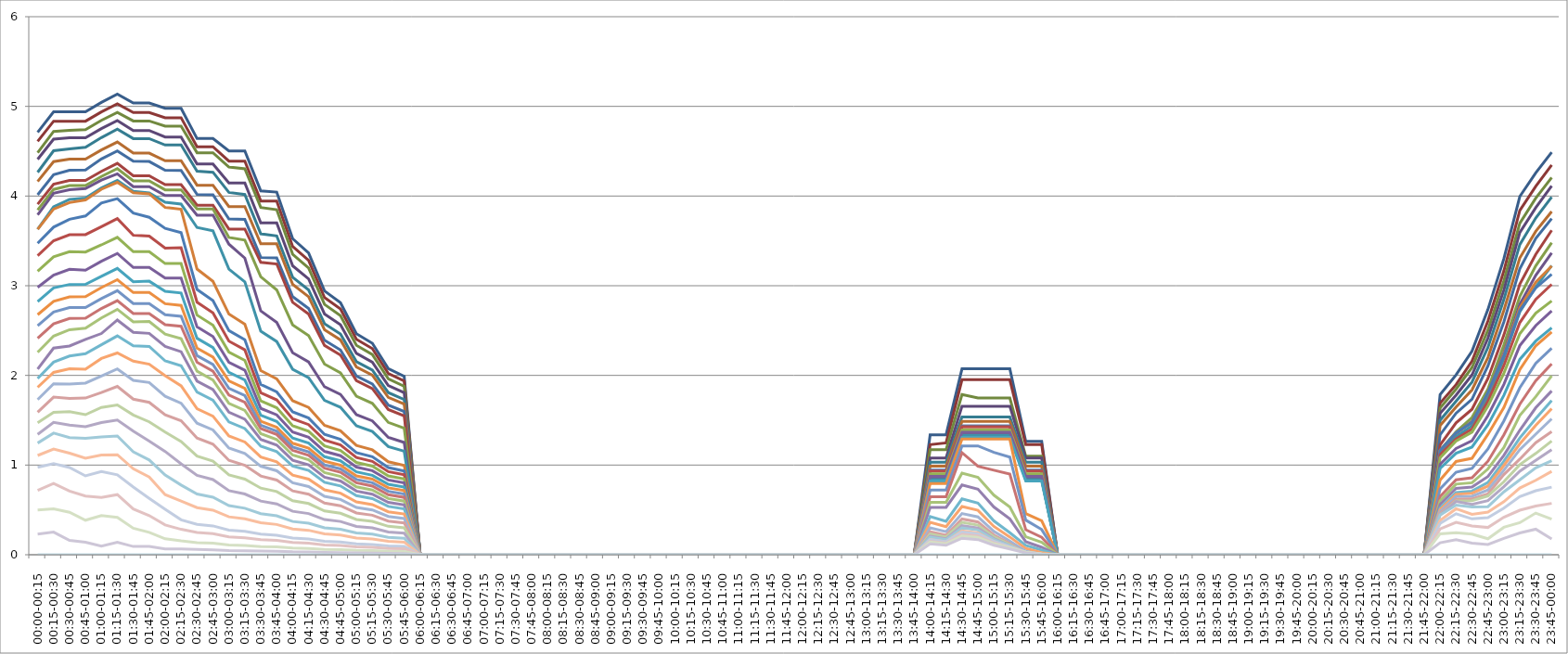
| Category | Series 0 | Series 1 | Series 2 | Series 3 | Series 4 | Series 5 | Series 6 | Series 7 | Series 8 | Series 9 | Series 10 | Series 11 | Series 12 | Series 13 | Series 14 | Series 15 | Series 16 | Series 17 | Series 18 | Series 19 | Series 20 | Series 21 | Series 22 | Series 23 | Series 24 | Series 25 | Series 26 | Series 27 | Series 28 | Series 29 | Series 30 | Series 31 | Series 32 | Series 33 | Series 34 |
|---|---|---|---|---|---|---|---|---|---|---|---|---|---|---|---|---|---|---|---|---|---|---|---|---|---|---|---|---|---|---|---|---|---|---|---|
| 00:00-00:15 | 4.71 | 4.61 | 4.484 | 4.41 | 4.265 | 4.162 | 4.014 | 3.91 | 3.845 | 3.791 | 3.629 | 3.629 | 3.473 | 3.335 | 3.162 | 2.982 | 2.822 | 2.677 | 2.554 | 2.415 | 2.258 | 2.07 | 1.966 | 1.867 | 1.73 | 1.589 | 1.472 | 1.342 | 1.245 | 1.107 | 0.974 | 0.718 | 0.499 | 0.23 | 0 |
| 00:15-00:30 | 4.939 | 4.835 | 4.72 | 4.634 | 4.505 | 4.384 | 4.238 | 4.131 | 4.074 | 4.031 | 3.879 | 3.855 | 3.654 | 3.501 | 3.323 | 3.119 | 2.976 | 2.826 | 2.707 | 2.575 | 2.438 | 2.304 | 2.148 | 2.033 | 1.906 | 1.758 | 1.588 | 1.476 | 1.356 | 1.179 | 1.016 | 0.795 | 0.512 | 0.253 | 0 |
| 00:30-00:45 | 4.939 | 4.835 | 4.733 | 4.649 | 4.526 | 4.412 | 4.288 | 4.174 | 4.117 | 4.07 | 3.963 | 3.928 | 3.741 | 3.568 | 3.379 | 3.182 | 3.014 | 2.876 | 2.757 | 2.635 | 2.51 | 2.328 | 2.216 | 2.074 | 1.905 | 1.743 | 1.595 | 1.447 | 1.306 | 1.133 | 0.973 | 0.71 | 0.473 | 0.159 | 0 |
| 00:45-01:00 | 4.939 | 4.835 | 4.741 | 4.649 | 4.543 | 4.412 | 4.29 | 4.174 | 4.117 | 4.083 | 3.977 | 3.956 | 3.777 | 3.57 | 3.376 | 3.173 | 3.016 | 2.879 | 2.757 | 2.638 | 2.527 | 2.401 | 2.242 | 2.069 | 1.915 | 1.747 | 1.561 | 1.429 | 1.298 | 1.076 | 0.879 | 0.655 | 0.385 | 0.139 | 0 |
| 01:00-01:15 | 5.044 | 4.938 | 4.844 | 4.752 | 4.652 | 4.514 | 4.413 | 4.275 | 4.218 | 4.177 | 4.092 | 4.076 | 3.923 | 3.659 | 3.455 | 3.273 | 3.104 | 2.98 | 2.857 | 2.746 | 2.641 | 2.467 | 2.342 | 2.189 | 1.993 | 1.809 | 1.643 | 1.475 | 1.315 | 1.111 | 0.927 | 0.638 | 0.437 | 0.095 | 0 |
| 01:15-01:30 | 5.136 | 5.028 | 4.934 | 4.841 | 4.746 | 4.603 | 4.504 | 4.364 | 4.306 | 4.248 | 4.175 | 4.153 | 3.972 | 3.748 | 3.539 | 3.36 | 3.192 | 3.068 | 2.944 | 2.833 | 2.737 | 2.618 | 2.44 | 2.25 | 2.072 | 1.877 | 1.671 | 1.503 | 1.325 | 1.116 | 0.892 | 0.67 | 0.417 | 0.138 | 0 |
| 01:30-01:45 | 5.038 | 4.931 | 4.837 | 4.731 | 4.641 | 4.479 | 4.388 | 4.226 | 4.169 | 4.105 | 4.053 | 4.037 | 3.81 | 3.564 | 3.38 | 3.203 | 3.044 | 2.924 | 2.801 | 2.69 | 2.597 | 2.481 | 2.329 | 2.159 | 1.945 | 1.735 | 1.559 | 1.379 | 1.147 | 0.959 | 0.755 | 0.51 | 0.296 | 0.092 | 0 |
| 01:45-02:00 | 5.038 | 4.931 | 4.837 | 4.731 | 4.641 | 4.479 | 4.385 | 4.226 | 4.169 | 4.105 | 4.034 | 4.025 | 3.763 | 3.553 | 3.38 | 3.203 | 3.051 | 2.924 | 2.801 | 2.69 | 2.602 | 2.469 | 2.323 | 2.125 | 1.921 | 1.699 | 1.482 | 1.268 | 1.057 | 0.866 | 0.628 | 0.437 | 0.25 | 0.092 | 0 |
| 02:00-02:15 | 4.979 | 4.874 | 4.78 | 4.658 | 4.569 | 4.393 | 4.288 | 4.127 | 4.069 | 4.005 | 3.93 | 3.873 | 3.639 | 3.419 | 3.247 | 3.084 | 2.938 | 2.799 | 2.677 | 2.566 | 2.46 | 2.323 | 2.162 | 1.997 | 1.767 | 1.559 | 1.369 | 1.152 | 0.89 | 0.671 | 0.507 | 0.332 | 0.177 | 0.064 | 0 |
| 02:15-02:30 | 4.979 | 4.874 | 4.78 | 4.658 | 4.569 | 4.393 | 4.285 | 4.127 | 4.069 | 4.005 | 3.911 | 3.853 | 3.593 | 3.424 | 3.247 | 3.084 | 2.919 | 2.781 | 2.659 | 2.548 | 2.41 | 2.264 | 2.108 | 1.884 | 1.69 | 1.494 | 1.263 | 1.014 | 0.777 | 0.599 | 0.39 | 0.284 | 0.154 | 0.064 | 0 |
| 02:30-02:45 | 4.641 | 4.549 | 4.483 | 4.358 | 4.276 | 4.12 | 4.019 | 3.898 | 3.856 | 3.787 | 3.649 | 3.186 | 2.959 | 2.817 | 2.673 | 2.541 | 2.414 | 2.305 | 2.221 | 2.147 | 2.046 | 1.937 | 1.814 | 1.627 | 1.467 | 1.301 | 1.101 | 0.885 | 0.678 | 0.525 | 0.34 | 0.248 | 0.135 | 0.059 | 0 |
| 02:45-03:00 | 4.641 | 4.549 | 4.483 | 4.358 | 4.265 | 4.12 | 4.015 | 3.898 | 3.856 | 3.787 | 3.612 | 3.049 | 2.833 | 2.698 | 2.56 | 2.433 | 2.31 | 2.205 | 2.121 | 2.047 | 1.949 | 1.842 | 1.723 | 1.545 | 1.392 | 1.233 | 1.043 | 0.839 | 0.642 | 0.497 | 0.322 | 0.235 | 0.128 | 0.055 | 0 |
| 03:00-03:15 | 4.504 | 4.39 | 4.324 | 4.146 | 4.041 | 3.883 | 3.744 | 3.632 | 3.538 | 3.464 | 3.185 | 2.684 | 2.5 | 2.382 | 2.259 | 2.146 | 2.033 | 1.938 | 1.856 | 1.782 | 1.689 | 1.589 | 1.481 | 1.325 | 1.19 | 1.053 | 0.89 | 0.715 | 0.548 | 0.423 | 0.275 | 0.2 | 0.109 | 0.046 | 0 |
| 03:15-03:30 | 4.504 | 4.39 | 4.303 | 4.146 | 4.017 | 3.883 | 3.739 | 3.632 | 3.508 | 3.308 | 3.043 | 2.571 | 2.398 | 2.285 | 2.167 | 2.058 | 1.948 | 1.856 | 1.775 | 1.7 | 1.609 | 1.511 | 1.407 | 1.257 | 1.128 | 0.997 | 0.843 | 0.677 | 0.519 | 0.4 | 0.26 | 0.189 | 0.103 | 0.043 | 0 |
| 03:30-03:45 | 4.057 | 3.945 | 3.872 | 3.7 | 3.579 | 3.467 | 3.316 | 3.26 | 3.1 | 2.719 | 2.494 | 2.053 | 1.899 | 1.806 | 1.715 | 1.632 | 1.556 | 1.488 | 1.444 | 1.408 | 1.35 | 1.287 | 1.211 | 1.091 | 0.987 | 0.878 | 0.743 | 0.598 | 0.458 | 0.356 | 0.229 | 0.168 | 0.092 | 0.041 | 0 |
| 03:45-04:00 | 4.044 | 3.945 | 3.848 | 3.7 | 3.555 | 3.467 | 3.311 | 3.243 | 2.954 | 2.591 | 2.377 | 1.961 | 1.815 | 1.727 | 1.639 | 1.56 | 1.486 | 1.421 | 1.378 | 1.341 | 1.285 | 1.223 | 1.151 | 1.035 | 0.937 | 0.833 | 0.705 | 0.567 | 0.434 | 0.338 | 0.217 | 0.16 | 0.087 | 0.039 | 0 |
| 04:00-04:15 | 3.525 | 3.438 | 3.351 | 3.222 | 3.095 | 3.016 | 2.878 | 2.815 | 2.564 | 2.253 | 2.069 | 1.717 | 1.593 | 1.516 | 1.439 | 1.368 | 1.301 | 1.243 | 1.201 | 1.164 | 1.112 | 1.054 | 0.989 | 0.889 | 0.802 | 0.712 | 0.602 | 0.485 | 0.371 | 0.288 | 0.186 | 0.136 | 0.074 | 0.033 | 0 |
| 04:15-04:30 | 3.365 | 3.282 | 3.198 | 3.076 | 2.953 | 2.877 | 2.745 | 2.683 | 2.444 | 2.149 | 1.974 | 1.643 | 1.525 | 1.451 | 1.377 | 1.31 | 1.245 | 1.189 | 1.146 | 1.11 | 1.058 | 1.003 | 0.94 | 0.844 | 0.761 | 0.675 | 0.571 | 0.459 | 0.352 | 0.273 | 0.176 | 0.129 | 0.07 | 0.031 | 0 |
| 04:30-04:45 | 2.942 | 2.868 | 2.792 | 2.685 | 2.577 | 2.509 | 2.392 | 2.334 | 2.126 | 1.873 | 1.721 | 1.443 | 1.343 | 1.279 | 1.213 | 1.153 | 1.094 | 1.043 | 1.002 | 0.965 | 0.917 | 0.865 | 0.808 | 0.724 | 0.651 | 0.577 | 0.488 | 0.392 | 0.3 | 0.232 | 0.15 | 0.11 | 0.06 | 0.026 | 0 |
| 04:45-05:00 | 2.811 | 2.741 | 2.667 | 2.565 | 2.461 | 2.396 | 2.283 | 2.226 | 2.028 | 1.788 | 1.644 | 1.382 | 1.287 | 1.226 | 1.163 | 1.105 | 1.047 | 0.999 | 0.957 | 0.92 | 0.873 | 0.823 | 0.768 | 0.687 | 0.617 | 0.546 | 0.462 | 0.371 | 0.284 | 0.22 | 0.143 | 0.104 | 0.057 | 0.024 | 0 |
| 05:00-05:15 | 2.465 | 2.403 | 2.335 | 2.246 | 2.154 | 2.094 | 1.994 | 1.941 | 1.768 | 1.562 | 1.438 | 1.22 | 1.138 | 1.085 | 1.029 | 0.977 | 0.924 | 0.88 | 0.839 | 0.802 | 0.757 | 0.71 | 0.66 | 0.589 | 0.528 | 0.466 | 0.394 | 0.316 | 0.242 | 0.186 | 0.121 | 0.088 | 0.048 | 0.02 | 0 |
| 05:15-05:30 | 2.359 | 2.299 | 2.233 | 2.148 | 2.059 | 2.002 | 1.905 | 1.853 | 1.688 | 1.493 | 1.375 | 1.17 | 1.093 | 1.042 | 0.988 | 0.938 | 0.886 | 0.843 | 0.803 | 0.766 | 0.722 | 0.675 | 0.627 | 0.559 | 0.5 | 0.441 | 0.373 | 0.299 | 0.229 | 0.176 | 0.115 | 0.083 | 0.045 | 0.018 | 0 |
| 05:30-05:45 | 2.076 | 2.022 | 1.962 | 1.888 | 1.808 | 1.756 | 1.669 | 1.62 | 1.476 | 1.308 | 1.206 | 1.037 | 0.971 | 0.927 | 0.879 | 0.834 | 0.785 | 0.746 | 0.707 | 0.669 | 0.627 | 0.583 | 0.539 | 0.479 | 0.427 | 0.376 | 0.317 | 0.254 | 0.195 | 0.149 | 0.098 | 0.071 | 0.038 | 0.015 | 0 |
| 05:45-06:00 | 1.989 | 1.937 | 1.879 | 1.807 | 1.731 | 1.68 | 1.597 | 1.548 | 1.41 | 1.252 | 1.154 | 0.996 | 0.934 | 0.892 | 0.845 | 0.801 | 0.754 | 0.716 | 0.677 | 0.64 | 0.598 | 0.555 | 0.512 | 0.454 | 0.404 | 0.355 | 0.3 | 0.241 | 0.184 | 0.141 | 0.093 | 0.067 | 0.036 | 0.014 | 0 |
| 06:00-06:15 | 0 | 0 | 0 | 0 | 0 | 0 | 0 | 0 | 0 | 0 | 0 | 0 | 0 | 0 | 0 | 0 | 0 | 0 | 0 | 0 | 0 | 0 | 0 | 0 | 0 | 0 | 0 | 0 | 0 | 0 | 0 | 0 | 0 | 0 | 0 |
| 06:15-06:30 | 0 | 0 | 0 | 0 | 0 | 0 | 0 | 0 | 0 | 0 | 0 | 0 | 0 | 0 | 0 | 0 | 0 | 0 | 0 | 0 | 0 | 0 | 0 | 0 | 0 | 0 | 0 | 0 | 0 | 0 | 0 | 0 | 0 | 0 | 0 |
| 06:30-06:45 | 0 | 0 | 0 | 0 | 0 | 0 | 0 | 0 | 0 | 0 | 0 | 0 | 0 | 0 | 0 | 0 | 0 | 0 | 0 | 0 | 0 | 0 | 0 | 0 | 0 | 0 | 0 | 0 | 0 | 0 | 0 | 0 | 0 | 0 | 0 |
| 06:45-07:00 | 0 | 0 | 0 | 0 | 0 | 0 | 0 | 0 | 0 | 0 | 0 | 0 | 0 | 0 | 0 | 0 | 0 | 0 | 0 | 0 | 0 | 0 | 0 | 0 | 0 | 0 | 0 | 0 | 0 | 0 | 0 | 0 | 0 | 0 | 0 |
| 07:00-07:15 | 0 | 0 | 0 | 0 | 0 | 0 | 0 | 0 | 0 | 0 | 0 | 0 | 0 | 0 | 0 | 0 | 0 | 0 | 0 | 0 | 0 | 0 | 0 | 0 | 0 | 0 | 0 | 0 | 0 | 0 | 0 | 0 | 0 | 0 | 0 |
| 07:15-07:30 | 0 | 0 | 0 | 0 | 0 | 0 | 0 | 0 | 0 | 0 | 0 | 0 | 0 | 0 | 0 | 0 | 0 | 0 | 0 | 0 | 0 | 0 | 0 | 0 | 0 | 0 | 0 | 0 | 0 | 0 | 0 | 0 | 0 | 0 | 0 |
| 07:30-07:45 | 0 | 0 | 0 | 0 | 0 | 0 | 0 | 0 | 0 | 0 | 0 | 0 | 0 | 0 | 0 | 0 | 0 | 0 | 0 | 0 | 0 | 0 | 0 | 0 | 0 | 0 | 0 | 0 | 0 | 0 | 0 | 0 | 0 | 0 | 0 |
| 07:45-08:00 | 0 | 0 | 0 | 0 | 0 | 0 | 0 | 0 | 0 | 0 | 0 | 0 | 0 | 0 | 0 | 0 | 0 | 0 | 0 | 0 | 0 | 0 | 0 | 0 | 0 | 0 | 0 | 0 | 0 | 0 | 0 | 0 | 0 | 0 | 0 |
| 08:00-08:15 | 0 | 0 | 0 | 0 | 0 | 0 | 0 | 0 | 0 | 0 | 0 | 0 | 0 | 0 | 0 | 0 | 0 | 0 | 0 | 0 | 0 | 0 | 0 | 0 | 0 | 0 | 0 | 0 | 0 | 0 | 0 | 0 | 0 | 0 | 0 |
| 08:15-08:30 | 0 | 0 | 0 | 0 | 0 | 0 | 0 | 0 | 0 | 0 | 0 | 0 | 0 | 0 | 0 | 0 | 0 | 0 | 0 | 0 | 0 | 0 | 0 | 0 | 0 | 0 | 0 | 0 | 0 | 0 | 0 | 0 | 0 | 0 | 0 |
| 08:30-08:45 | 0 | 0 | 0 | 0 | 0 | 0 | 0 | 0 | 0 | 0 | 0 | 0 | 0 | 0 | 0 | 0 | 0 | 0 | 0 | 0 | 0 | 0 | 0 | 0 | 0 | 0 | 0 | 0 | 0 | 0 | 0 | 0 | 0 | 0 | 0 |
| 08:45-09:00 | 0 | 0 | 0 | 0 | 0 | 0 | 0 | 0 | 0 | 0 | 0 | 0 | 0 | 0 | 0 | 0 | 0 | 0 | 0 | 0 | 0 | 0 | 0 | 0 | 0 | 0 | 0 | 0 | 0 | 0 | 0 | 0 | 0 | 0 | 0 |
| 09:00-09:15 | 0 | 0 | 0 | 0 | 0 | 0 | 0 | 0 | 0 | 0 | 0 | 0 | 0 | 0 | 0 | 0 | 0 | 0 | 0 | 0 | 0 | 0 | 0 | 0 | 0 | 0 | 0 | 0 | 0 | 0 | 0 | 0 | 0 | 0 | 0 |
| 09:15-09:30 | 0 | 0 | 0 | 0 | 0 | 0 | 0 | 0 | 0 | 0 | 0 | 0 | 0 | 0 | 0 | 0 | 0 | 0 | 0 | 0 | 0 | 0 | 0 | 0 | 0 | 0 | 0 | 0 | 0 | 0 | 0 | 0 | 0 | 0 | 0 |
| 09:30-09:45 | 0 | 0 | 0 | 0 | 0 | 0 | 0 | 0 | 0 | 0 | 0 | 0 | 0 | 0 | 0 | 0 | 0 | 0 | 0 | 0 | 0 | 0 | 0 | 0 | 0 | 0 | 0 | 0 | 0 | 0 | 0 | 0 | 0 | 0 | 0 |
| 09:45-10:00 | 0 | 0 | 0 | 0 | 0 | 0 | 0 | 0 | 0 | 0 | 0 | 0 | 0 | 0 | 0 | 0 | 0 | 0 | 0 | 0 | 0 | 0 | 0 | 0 | 0 | 0 | 0 | 0 | 0 | 0 | 0 | 0 | 0 | 0 | 0 |
| 10:00-10:15 | 0 | 0 | 0 | 0 | 0 | 0 | 0 | 0 | 0 | 0 | 0 | 0 | 0 | 0 | 0 | 0 | 0 | 0 | 0 | 0 | 0 | 0 | 0 | 0 | 0 | 0 | 0 | 0 | 0 | 0 | 0 | 0 | 0 | 0 | 0 |
| 10:15-10:30 | 0 | 0 | 0 | 0 | 0 | 0 | 0 | 0 | 0 | 0 | 0 | 0 | 0 | 0 | 0 | 0 | 0 | 0 | 0 | 0 | 0 | 0 | 0 | 0 | 0 | 0 | 0 | 0 | 0 | 0 | 0 | 0 | 0 | 0 | 0 |
| 10:30-10:45 | 0 | 0 | 0 | 0 | 0 | 0 | 0 | 0 | 0 | 0 | 0 | 0 | 0 | 0 | 0 | 0 | 0 | 0 | 0 | 0 | 0 | 0 | 0 | 0 | 0 | 0 | 0 | 0 | 0 | 0 | 0 | 0 | 0 | 0 | 0 |
| 10:45-11:00 | 0 | 0 | 0 | 0 | 0 | 0 | 0 | 0 | 0 | 0 | 0 | 0 | 0 | 0 | 0 | 0 | 0 | 0 | 0 | 0 | 0 | 0 | 0 | 0 | 0 | 0 | 0 | 0 | 0 | 0 | 0 | 0 | 0 | 0 | 0 |
| 11:00-11:15 | 0 | 0 | 0 | 0 | 0 | 0 | 0 | 0 | 0 | 0 | 0 | 0 | 0 | 0 | 0 | 0 | 0 | 0 | 0 | 0 | 0 | 0 | 0 | 0 | 0 | 0 | 0 | 0 | 0 | 0 | 0 | 0 | 0 | 0 | 0 |
| 11:15-11:30 | 0 | 0 | 0 | 0 | 0 | 0 | 0 | 0 | 0 | 0 | 0 | 0 | 0 | 0 | 0 | 0 | 0 | 0 | 0 | 0 | 0 | 0 | 0 | 0 | 0 | 0 | 0 | 0 | 0 | 0 | 0 | 0 | 0 | 0 | 0 |
| 11:30-11:45 | 0 | 0 | 0 | 0 | 0 | 0 | 0 | 0 | 0 | 0 | 0 | 0 | 0 | 0 | 0 | 0 | 0 | 0 | 0 | 0 | 0 | 0 | 0 | 0 | 0 | 0 | 0 | 0 | 0 | 0 | 0 | 0 | 0 | 0 | 0 |
| 11:45-12:00 | 0 | 0 | 0 | 0 | 0 | 0 | 0 | 0 | 0 | 0 | 0 | 0 | 0 | 0 | 0 | 0 | 0 | 0 | 0 | 0 | 0 | 0 | 0 | 0 | 0 | 0 | 0 | 0 | 0 | 0 | 0 | 0 | 0 | 0 | 0 |
| 12:00-12:15 | 0 | 0 | 0 | 0 | 0 | 0 | 0 | 0 | 0 | 0 | 0 | 0 | 0 | 0 | 0 | 0 | 0 | 0 | 0 | 0 | 0 | 0 | 0 | 0 | 0 | 0 | 0 | 0 | 0 | 0 | 0 | 0 | 0 | 0 | 0 |
| 12:15-12:30 | 0 | 0 | 0 | 0 | 0 | 0 | 0 | 0 | 0 | 0 | 0 | 0 | 0 | 0 | 0 | 0 | 0 | 0 | 0 | 0 | 0 | 0 | 0 | 0 | 0 | 0 | 0 | 0 | 0 | 0 | 0 | 0 | 0 | 0 | 0 |
| 12:30-12:45 | 0 | 0 | 0 | 0 | 0 | 0 | 0 | 0 | 0 | 0 | 0 | 0 | 0 | 0 | 0 | 0 | 0 | 0 | 0 | 0 | 0 | 0 | 0 | 0 | 0 | 0 | 0 | 0 | 0 | 0 | 0 | 0 | 0 | 0 | 0 |
| 12:45-13:00 | 0 | 0 | 0 | 0 | 0 | 0 | 0 | 0 | 0 | 0 | 0 | 0 | 0 | 0 | 0 | 0 | 0 | 0 | 0 | 0 | 0 | 0 | 0 | 0 | 0 | 0 | 0 | 0 | 0 | 0 | 0 | 0 | 0 | 0 | 0 |
| 13:00-13:15 | 0 | 0 | 0 | 0 | 0 | 0 | 0 | 0 | 0 | 0 | 0 | 0 | 0 | 0 | 0 | 0 | 0 | 0 | 0 | 0 | 0 | 0 | 0 | 0 | 0 | 0 | 0 | 0 | 0 | 0 | 0 | 0 | 0 | 0 | 0 |
| 13:15-13:30 | 0 | 0 | 0 | 0 | 0 | 0 | 0 | 0 | 0 | 0 | 0 | 0 | 0 | 0 | 0 | 0 | 0 | 0 | 0 | 0 | 0 | 0 | 0 | 0 | 0 | 0 | 0 | 0 | 0 | 0 | 0 | 0 | 0 | 0 | 0 |
| 13:30-13:45 | 0 | 0 | 0 | 0 | 0 | 0 | 0 | 0 | 0 | 0 | 0 | 0 | 0 | 0 | 0 | 0 | 0 | 0 | 0 | 0 | 0 | 0 | 0 | 0 | 0 | 0 | 0 | 0 | 0 | 0 | 0 | 0 | 0 | 0 | 0 |
| 13:45-14:00 | 0 | 0 | 0 | 0 | 0 | 0 | 0 | 0 | 0 | 0 | 0 | 0 | 0 | 0 | 0 | 0 | 0 | 0 | 0 | 0 | 0 | 0 | 0 | 0 | 0 | 0 | 0 | 0 | 0 | 0 | 0 | 0 | 0 | 0 | 0 |
| 14:00-14:15 | 1.337 | 1.228 | 1.171 | 1.078 | 1.033 | 0.988 | 0.936 | 0.871 | 0.838 | 0.847 | 0.838 | 0.934 | 0.943 | 0.934 | 0.903 | 0.874 | 0.821 | 0.794 | 0.721 | 0.645 | 0.586 | 0.528 | 0.427 | 0.361 | 0.3 | 0.256 | 0.232 | 0.209 | 0.196 | 0.171 | 0.169 | 0.15 | 0.141 | 0.122 | 0 |
| 14:15-14:30 | 1.337 | 1.247 | 1.171 | 1.078 | 1.033 | 0.988 | 0.936 | 0.871 | 0.838 | 0.847 | 0.838 | 0.934 | 0.943 | 0.934 | 0.903 | 0.874 | 0.821 | 0.794 | 0.721 | 0.645 | 0.586 | 0.528 | 0.373 | 0.312 | 0.257 | 0.217 | 0.197 | 0.178 | 0.167 | 0.145 | 0.146 | 0.13 | 0.122 | 0.105 | 0 |
| 14:30-14:45 | 2.074 | 1.952 | 1.787 | 1.656 | 1.535 | 1.487 | 1.435 | 1.37 | 1.336 | 1.343 | 1.333 | 1.428 | 1.435 | 1.427 | 1.392 | 1.365 | 1.31 | 1.29 | 1.214 | 1.139 | 0.91 | 0.778 | 0.623 | 0.538 | 0.459 | 0.399 | 0.361 | 0.325 | 0.3 | 0.265 | 0.254 | 0.227 | 0.209 | 0.184 | 0 |
| 14:45-15:00 | 2.074 | 1.952 | 1.748 | 1.656 | 1.535 | 1.487 | 1.435 | 1.37 | 1.336 | 1.343 | 1.333 | 1.428 | 1.435 | 1.427 | 1.392 | 1.365 | 1.31 | 1.29 | 1.214 | 0.985 | 0.864 | 0.732 | 0.577 | 0.496 | 0.422 | 0.365 | 0.331 | 0.298 | 0.276 | 0.243 | 0.234 | 0.209 | 0.193 | 0.169 | 0 |
| 15:00-15:15 | 2.074 | 1.952 | 1.748 | 1.656 | 1.535 | 1.487 | 1.435 | 1.37 | 1.336 | 1.343 | 1.333 | 1.428 | 1.435 | 1.427 | 1.392 | 1.365 | 1.31 | 1.29 | 1.142 | 0.943 | 0.664 | 0.532 | 0.377 | 0.316 | 0.26 | 0.22 | 0.2 | 0.18 | 0.169 | 0.147 | 0.148 | 0.131 | 0.123 | 0.107 | 0 |
| 15:15-15:30 | 2.074 | 1.952 | 1.748 | 1.656 | 1.535 | 1.487 | 1.435 | 1.37 | 1.336 | 1.343 | 1.333 | 1.428 | 1.435 | 1.427 | 1.392 | 1.365 | 1.31 | 1.29 | 1.089 | 0.9 | 0.533 | 0.401 | 0.246 | 0.198 | 0.153 | 0.124 | 0.113 | 0.102 | 0.1 | 0.084 | 0.091 | 0.08 | 0.078 | 0.065 | 0 |
| 15:30-15:45 | 1.264 | 1.228 | 1.099 | 1.078 | 1.033 | 0.988 | 0.936 | 0.871 | 0.838 | 0.847 | 0.838 | 0.934 | 0.943 | 0.934 | 0.903 | 0.874 | 0.821 | 0.458 | 0.386 | 0.279 | 0.201 | 0.146 | 0.105 | 0.071 | 0.039 | 0.021 | 0.021 | 0.019 | 0.025 | 0.017 | 0.031 | 0.026 | 0.029 | 0.021 | 0 |
| 15:45-16:00 | 1.264 | 1.228 | 1.099 | 1.078 | 1.033 | 0.988 | 0.936 | 0.871 | 0.838 | 0.847 | 0.838 | 0.934 | 0.943 | 0.934 | 0.903 | 0.874 | 0.821 | 0.379 | 0.281 | 0.194 | 0.138 | 0.083 | 0.051 | 0.023 | 0.005 | 0.005 | 0.005 | 0.005 | 0.005 | 0.005 | 0.008 | 0.005 | 0.01 | 0.004 | 0 |
| 16:00-16:15 | 0 | 0 | 0 | 0 | 0 | 0 | 0 | 0 | 0 | 0 | 0 | 0 | 0 | 0 | 0 | 0 | 0 | 0 | 0 | 0 | 0 | 0 | 0 | 0 | 0 | 0 | 0 | 0 | 0 | 0 | 0 | 0 | 0 | 0 | 0 |
| 16:15-16:30 | 0 | 0 | 0 | 0 | 0 | 0 | 0 | 0 | 0 | 0 | 0 | 0 | 0 | 0 | 0 | 0 | 0 | 0 | 0 | 0 | 0 | 0 | 0 | 0 | 0 | 0 | 0 | 0 | 0 | 0 | 0 | 0 | 0 | 0 | 0 |
| 16:30-16:45 | 0 | 0 | 0 | 0 | 0 | 0 | 0 | 0 | 0 | 0 | 0 | 0 | 0 | 0 | 0 | 0 | 0 | 0 | 0 | 0 | 0 | 0 | 0 | 0 | 0 | 0 | 0 | 0 | 0 | 0 | 0 | 0 | 0 | 0 | 0 |
| 16:45-17:00 | 0 | 0 | 0 | 0 | 0 | 0 | 0 | 0 | 0 | 0 | 0 | 0 | 0 | 0 | 0 | 0 | 0 | 0 | 0 | 0 | 0 | 0 | 0 | 0 | 0 | 0 | 0 | 0 | 0 | 0 | 0 | 0 | 0 | 0 | 0 |
| 17:00-17:15 | 0 | 0 | 0 | 0 | 0 | 0 | 0 | 0 | 0 | 0 | 0 | 0 | 0 | 0 | 0 | 0 | 0 | 0 | 0 | 0 | 0 | 0 | 0 | 0 | 0 | 0 | 0 | 0 | 0 | 0 | 0 | 0 | 0 | 0 | 0 |
| 17:15-17:30 | 0 | 0 | 0 | 0 | 0 | 0 | 0 | 0 | 0 | 0 | 0 | 0 | 0 | 0 | 0 | 0 | 0 | 0 | 0 | 0 | 0 | 0 | 0 | 0 | 0 | 0 | 0 | 0 | 0 | 0 | 0 | 0 | 0 | 0 | 0 |
| 17:30-17:45 | 0 | 0 | 0 | 0 | 0 | 0 | 0 | 0 | 0 | 0 | 0 | 0 | 0 | 0 | 0 | 0 | 0 | 0 | 0 | 0 | 0 | 0 | 0 | 0 | 0 | 0 | 0 | 0 | 0 | 0 | 0 | 0 | 0 | 0 | 0 |
| 17:45-18:00 | 0 | 0 | 0 | 0 | 0 | 0 | 0 | 0 | 0 | 0 | 0 | 0 | 0 | 0 | 0 | 0 | 0 | 0 | 0 | 0 | 0 | 0 | 0 | 0 | 0 | 0 | 0 | 0 | 0 | 0 | 0 | 0 | 0 | 0 | 0 |
| 18:00-18:15 | 0 | 0 | 0 | 0 | 0 | 0 | 0 | 0 | 0 | 0 | 0 | 0 | 0 | 0 | 0 | 0 | 0 | 0 | 0 | 0 | 0 | 0 | 0 | 0 | 0 | 0 | 0 | 0 | 0 | 0 | 0 | 0 | 0 | 0 | 0 |
| 18:15-18:30 | 0 | 0 | 0 | 0 | 0 | 0 | 0 | 0 | 0 | 0 | 0 | 0 | 0 | 0 | 0 | 0 | 0 | 0 | 0 | 0 | 0 | 0 | 0 | 0 | 0 | 0 | 0 | 0 | 0 | 0 | 0 | 0 | 0 | 0 | 0 |
| 18:30-18:45 | 0 | 0 | 0 | 0 | 0 | 0 | 0 | 0 | 0 | 0 | 0 | 0 | 0 | 0 | 0 | 0 | 0 | 0 | 0 | 0 | 0 | 0 | 0 | 0 | 0 | 0 | 0 | 0 | 0 | 0 | 0 | 0 | 0 | 0 | 0 |
| 18:45-19:00 | 0 | 0 | 0 | 0 | 0 | 0 | 0 | 0 | 0 | 0 | 0 | 0 | 0 | 0 | 0 | 0 | 0 | 0 | 0 | 0 | 0 | 0 | 0 | 0 | 0 | 0 | 0 | 0 | 0 | 0 | 0 | 0 | 0 | 0 | 0 |
| 19:00-19:15 | 0 | 0 | 0 | 0 | 0 | 0 | 0 | 0 | 0 | 0 | 0 | 0 | 0 | 0 | 0 | 0 | 0 | 0 | 0 | 0 | 0 | 0 | 0 | 0 | 0 | 0 | 0 | 0 | 0 | 0 | 0 | 0 | 0 | 0 | 0 |
| 19:15-19:30 | 0 | 0 | 0 | 0 | 0 | 0 | 0 | 0 | 0 | 0 | 0 | 0 | 0 | 0 | 0 | 0 | 0 | 0 | 0 | 0 | 0 | 0 | 0 | 0 | 0 | 0 | 0 | 0 | 0 | 0 | 0 | 0 | 0 | 0 | 0 |
| 19:30-19:45 | 0 | 0 | 0 | 0 | 0 | 0 | 0 | 0 | 0 | 0 | 0 | 0 | 0 | 0 | 0 | 0 | 0 | 0 | 0 | 0 | 0 | 0 | 0 | 0 | 0 | 0 | 0 | 0 | 0 | 0 | 0 | 0 | 0 | 0 | 0 |
| 19:45-20:00 | 0 | 0 | 0 | 0 | 0 | 0 | 0 | 0 | 0 | 0 | 0 | 0 | 0 | 0 | 0 | 0 | 0 | 0 | 0 | 0 | 0 | 0 | 0 | 0 | 0 | 0 | 0 | 0 | 0 | 0 | 0 | 0 | 0 | 0 | 0 |
| 20:00-20:15 | 0 | 0 | 0 | 0 | 0 | 0 | 0 | 0 | 0 | 0 | 0 | 0 | 0 | 0 | 0 | 0 | 0 | 0 | 0 | 0 | 0 | 0 | 0 | 0 | 0 | 0 | 0 | 0 | 0 | 0 | 0 | 0 | 0 | 0 | 0 |
| 20:15-20:30 | 0 | 0 | 0 | 0 | 0 | 0 | 0 | 0 | 0 | 0 | 0 | 0 | 0 | 0 | 0 | 0 | 0 | 0 | 0 | 0 | 0 | 0 | 0 | 0 | 0 | 0 | 0 | 0 | 0 | 0 | 0 | 0 | 0 | 0 | 0 |
| 20:30-20:45 | 0 | 0 | 0 | 0 | 0 | 0 | 0 | 0 | 0 | 0 | 0 | 0 | 0 | 0 | 0 | 0 | 0 | 0 | 0 | 0 | 0 | 0 | 0 | 0 | 0 | 0 | 0 | 0 | 0 | 0 | 0 | 0 | 0 | 0 | 0 |
| 20:45-21:00 | 0 | 0 | 0 | 0 | 0 | 0 | 0 | 0 | 0 | 0 | 0 | 0 | 0 | 0 | 0 | 0 | 0 | 0 | 0 | 0 | 0 | 0 | 0 | 0 | 0 | 0 | 0 | 0 | 0 | 0 | 0 | 0 | 0 | 0 | 0 |
| 21:00-21:15 | 0 | 0 | 0 | 0 | 0 | 0 | 0 | 0 | 0 | 0 | 0 | 0 | 0 | 0 | 0 | 0 | 0 | 0 | 0 | 0 | 0 | 0 | 0 | 0 | 0 | 0 | 0 | 0 | 0 | 0 | 0 | 0 | 0 | 0 | 0 |
| 21:15-21:30 | 0 | 0 | 0 | 0 | 0 | 0 | 0 | 0 | 0 | 0 | 0 | 0 | 0 | 0 | 0 | 0 | 0 | 0 | 0 | 0 | 0 | 0 | 0 | 0 | 0 | 0 | 0 | 0 | 0 | 0 | 0 | 0 | 0 | 0 | 0 |
| 21:30-21:45 | 0 | 0 | 0 | 0 | 0 | 0 | 0 | 0 | 0 | 0 | 0 | 0 | 0 | 0 | 0 | 0 | 0 | 0 | 0 | 0 | 0 | 0 | 0 | 0 | 0 | 0 | 0 | 0 | 0 | 0 | 0 | 0 | 0 | 0 | 0 |
| 21:45-22:00 | 0 | 0 | 0 | 0 | 0 | 0 | 0 | 0 | 0 | 0 | 0 | 0 | 0 | 0 | 0 | 0 | 0 | 0 | 0 | 0 | 0 | 0 | 0 | 0 | 0 | 0 | 0 | 0 | 0 | 0 | 0 | 0 | 0 | 0 | 0 |
| 22:00-22:15 | 1.786 | 1.69 | 1.636 | 1.577 | 1.5 | 1.441 | 1.337 | 1.224 | 1.164 | 1.123 | 1.116 | 1.163 | 1.164 | 1.115 | 1.082 | 1.01 | 0.963 | 0.834 | 0.734 | 0.648 | 0.601 | 0.562 | 0.521 | 0.504 | 0.479 | 0.462 | 0.449 | 0.445 | 0.442 | 0.383 | 0.348 | 0.288 | 0.234 | 0.133 | 0 |
| 22:15-22:30 | 2.005 | 1.897 | 1.847 | 1.779 | 1.713 | 1.647 | 1.578 | 1.471 | 1.369 | 1.349 | 1.314 | 1.36 | 1.361 | 1.292 | 1.267 | 1.184 | 1.132 | 1.04 | 0.921 | 0.836 | 0.787 | 0.74 | 0.695 | 0.674 | 0.649 | 0.618 | 0.6 | 0.593 | 0.553 | 0.513 | 0.457 | 0.362 | 0.246 | 0.168 | 0 |
| 22:30-22:45 | 2.27 | 2.158 | 2.087 | 2.004 | 1.924 | 1.839 | 1.735 | 1.622 | 1.53 | 1.486 | 1.438 | 1.474 | 1.474 | 1.403 | 1.368 | 1.272 | 1.201 | 1.075 | 0.964 | 0.858 | 0.803 | 0.755 | 0.71 | 0.686 | 0.652 | 0.622 | 0.602 | 0.562 | 0.533 | 0.45 | 0.4 | 0.32 | 0.23 | 0.13 | 0 |
| 22:45-23:00 | 2.735 | 2.607 | 2.504 | 2.416 | 2.313 | 2.2 | 2.105 | 1.966 | 1.847 | 1.798 | 1.759 | 1.804 | 1.809 | 1.712 | 1.656 | 1.551 | 1.449 | 1.343 | 1.18 | 1.043 | 0.957 | 0.871 | 0.806 | 0.766 | 0.722 | 0.677 | 0.656 | 0.603 | 0.536 | 0.475 | 0.414 | 0.304 | 0.178 | 0.115 | 0 |
| 23:00-23:15 | 3.301 | 3.165 | 3.055 | 2.952 | 2.846 | 2.726 | 2.596 | 2.451 | 2.342 | 2.255 | 2.189 | 2.241 | 2.224 | 2.111 | 2.023 | 1.9 | 1.778 | 1.641 | 1.492 | 1.337 | 1.195 | 1.109 | 1.043 | 0.996 | 0.943 | 0.894 | 0.814 | 0.758 | 0.701 | 0.592 | 0.52 | 0.418 | 0.306 | 0.182 | 0 |
| 23:15-23:30 | 3.995 | 3.839 | 3.696 | 3.593 | 3.458 | 3.31 | 3.189 | 3.017 | 2.88 | 2.791 | 2.708 | 2.753 | 2.723 | 2.588 | 2.465 | 2.332 | 2.179 | 2.064 | 1.862 | 1.679 | 1.553 | 1.389 | 1.302 | 1.236 | 1.172 | 1.066 | 1.005 | 0.932 | 0.836 | 0.744 | 0.648 | 0.496 | 0.358 | 0.243 | 0 |
| 23:30-23:45 | 4.259 | 4.109 | 3.976 | 3.87 | 3.754 | 3.606 | 3.527 | 3.349 | 3.222 | 3.115 | 2.987 | 3.039 | 2.974 | 2.847 | 2.694 | 2.555 | 2.383 | 2.33 | 2.133 | 1.94 | 1.762 | 1.639 | 1.519 | 1.443 | 1.344 | 1.249 | 1.129 | 1.052 | 0.969 | 0.83 | 0.714 | 0.543 | 0.465 | 0.285 | 0 |
| 23:45-00:00 | 4.488 | 4.346 | 4.207 | 4.113 | 3.989 | 3.828 | 3.749 | 3.618 | 3.48 | 3.365 | 3.224 | 3.22 | 3.127 | 3.015 | 2.831 | 2.72 | 2.53 | 2.484 | 2.303 | 2.129 | 1.995 | 1.827 | 1.72 | 1.63 | 1.516 | 1.373 | 1.269 | 1.171 | 1.048 | 0.929 | 0.754 | 0.573 | 0.396 | 0.176 | 0 |